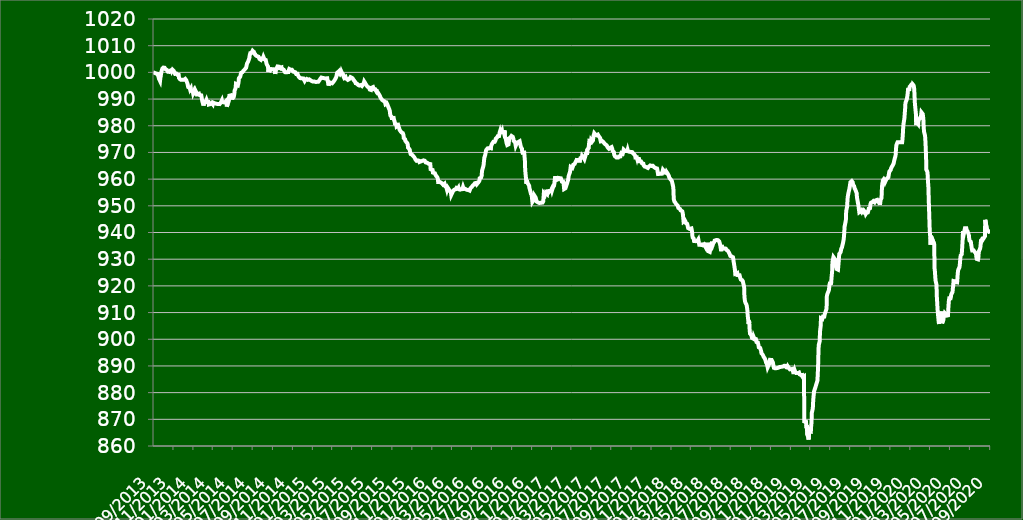
| Category | LAFISE20 |
|---|---|
| 2013-09-30 | 1000 |
| 2013-10-01 | 999.972 |
| 2013-10-02 | 999.948 |
| 2013-10-03 | 999.901 |
| 2013-10-04 | 999.84 |
| 2013-10-07 | 999.812 |
| 2013-10-08 | 999.609 |
| 2013-10-09 | 999.595 |
| 2013-10-10 | 999.647 |
| 2013-10-11 | 999.689 |
| 2013-10-14 | 999.425 |
| 2013-10-15 | 998.813 |
| 2013-10-16 | 998.53 |
| 2013-10-17 | 998.059 |
| 2013-10-18 | 997.559 |
| 2013-10-21 | 996.791 |
| 2013-10-22 | 997.87 |
| 2013-10-23 | 998.431 |
| 2013-10-24 | 998.327 |
| 2013-10-25 | 1000.137 |
| 2013-10-28 | 1001.399 |
| 2013-10-29 | 1001.602 |
| 2013-10-30 | 1001.772 |
| 2013-10-31 | 1001.79 |
| 2013-11-01 | 1001.677 |
| 2013-11-04 | 1001.725 |
| 2013-11-05 | 1001.739 |
| 2013-11-06 | 1001.503 |
| 2013-11-07 | 1001.173 |
| 2013-11-08 | 1001.018 |
| 2013-11-11 | 1000.909 |
| 2013-11-12 | 1001.022 |
| 2013-11-13 | 1000.542 |
| 2013-11-14 | 1000.24 |
| 2013-11-15 | 1000.123 |
| 2013-11-18 | 1000.179 |
| 2013-11-19 | 1000.231 |
| 2013-11-20 | 1000.245 |
| 2013-11-21 | 1000.627 |
| 2013-11-22 | 1000.759 |
| 2013-11-25 | 1000.895 |
| 2013-11-26 | 1000.518 |
| 2013-11-27 | 1000.768 |
| 2013-11-28 | 1000.989 |
| 2013-11-29 | 1000.909 |
| 2013-12-02 | 1000.499 |
| 2013-12-03 | 1000.424 |
| 2013-12-04 | 1000.382 |
| 2013-12-05 | 1000.212 |
| 2013-12-06 | 999.435 |
| 2013-12-09 | 999.585 |
| 2013-12-10 | 999.529 |
| 2013-12-11 | 999.637 |
| 2013-12-12 | 999.265 |
| 2013-12-13 | 999.095 |
| 2013-12-16 | 999.044 |
| 2013-12-17 | 999.034 |
| 2013-12-18 | 997.932 |
| 2013-12-19 | 997.644 |
| 2013-12-20 | 997.536 |
| 2013-12-23 | 997.211 |
| 2013-12-24 | 997.211 |
| 2014-01-02 | 997.201 |
| 2014-01-03 | 997.077 |
| 2014-01-06 | 997.564 |
| 2014-01-07 | 997.478 |
| 2014-01-08 | 997.511 |
| 2014-01-09 | 997.077 |
| 2014-01-10 | 996.829 |
| 2014-01-13 | 995.745 |
| 2014-01-14 | 995.735 |
| 2014-01-15 | 994.489 |
| 2014-01-16 | 994.37 |
| 2014-01-17 | 994.379 |
| 2014-01-20 | 994.083 |
| 2014-01-21 | 993.601 |
| 2014-01-22 | 993.892 |
| 2014-01-23 | 994.012 |
| 2014-01-24 | 993.128 |
| 2014-01-27 | 992.918 |
| 2014-01-28 | 993.171 |
| 2014-01-29 | 992.785 |
| 2014-01-30 | 992.197 |
| 2014-01-31 | 992.302 |
| 2014-02-03 | 993.381 |
| 2014-02-04 | 993.295 |
| 2014-02-05 | 992.837 |
| 2014-02-06 | 993.224 |
| 2014-02-07 | 993.3 |
| 2014-02-10 | 992.188 |
| 2014-02-11 | 992.469 |
| 2014-02-12 | 991.791 |
| 2014-02-13 | 991.911 |
| 2014-02-14 | 992.016 |
| 2014-02-17 | 992.011 |
| 2014-02-18 | 991.567 |
| 2014-02-19 | 991.739 |
| 2014-02-20 | 991.6 |
| 2014-02-21 | 991.491 |
| 2014-02-24 | 991.39 |
| 2014-02-25 | 991.152 |
| 2014-02-26 | 990.006 |
| 2014-02-27 | 989.256 |
| 2014-02-28 | 989.027 |
| 2014-03-03 | 987.58 |
| 2014-03-04 | 988.139 |
| 2014-03-05 | 988.95 |
| 2014-03-06 | 988.927 |
| 2014-03-07 | 989.237 |
| 2014-03-10 | 989.027 |
| 2014-03-11 | 989.122 |
| 2014-03-12 | 989.652 |
| 2014-03-13 | 989.509 |
| 2014-03-14 | 988.908 |
| 2014-03-17 | 988.97 |
| 2014-03-18 | 988.898 |
| 2014-03-19 | 987.957 |
| 2014-03-20 | 988.048 |
| 2014-03-21 | 987.986 |
| 2014-03-24 | 988.139 |
| 2014-03-25 | 988.091 |
| 2014-03-26 | 988.158 |
| 2014-03-27 | 988.416 |
| 2014-03-28 | 988.545 |
| 2014-03-31 | 988.081 |
| 2014-04-01 | 988.696 |
| 2014-04-02 | 988.648 |
| 2014-04-03 | 988.59 |
| 2014-04-04 | 988.546 |
| 2014-04-07 | 988.372 |
| 2014-04-08 | 988.275 |
| 2014-04-09 | 988.149 |
| 2014-04-10 | 988.202 |
| 2014-04-14 | 988.159 |
| 2014-04-15 | 988.178 |
| 2014-04-16 | 988.081 |
| 2014-04-21 | 988.111 |
| 2014-04-22 | 988.435 |
| 2014-04-23 | 988.425 |
| 2014-04-24 | 988.498 |
| 2014-04-25 | 988.599 |
| 2014-04-28 | 989.509 |
| 2014-04-29 | 988.948 |
| 2014-04-30 | 988.701 |
| 2014-05-02 | 988.672 |
| 2014-05-05 | 988.735 |
| 2014-05-06 | 988.846 |
| 2014-05-07 | 988.793 |
| 2014-05-08 | 988.793 |
| 2014-05-09 | 989.016 |
| 2014-05-12 | 989.417 |
| 2014-05-13 | 987.181 |
| 2014-05-14 | 987.06 |
| 2014-05-15 | 987.075 |
| 2014-05-16 | 988.265 |
| 2014-05-19 | 989.219 |
| 2014-05-20 | 990.066 |
| 2014-05-21 | 991.256 |
| 2014-05-22 | 991.252 |
| 2014-05-23 | 991.61 |
| 2014-05-26 | 991.421 |
| 2014-05-27 | 991.692 |
| 2014-05-28 | 991.74 |
| 2014-05-29 | 989.829 |
| 2014-05-30 | 990.235 |
| 2014-06-02 | 990.342 |
| 2014-06-03 | 990.743 |
| 2014-06-04 | 991.208 |
| 2014-06-05 | 991.803 |
| 2014-06-06 | 993.197 |
| 2014-06-09 | 994.151 |
| 2014-06-10 | 995.636 |
| 2014-06-11 | 995.453 |
| 2014-06-12 | 995.811 |
| 2014-06-13 | 995.67 |
| 2014-06-16 | 995.196 |
| 2014-06-17 | 995.312 |
| 2014-06-18 | 996.266 |
| 2014-06-19 | 997.814 |
| 2014-06-20 | 997.771 |
| 2014-06-23 | 998.366 |
| 2014-06-24 | 998.477 |
| 2014-06-25 | 999.412 |
| 2014-06-26 | 999.837 |
| 2014-06-27 | 1000.113 |
| 2014-06-30 | 1000.094 |
| 2014-07-01 | 1000.029 |
| 2014-07-02 | 1000.489 |
| 2014-07-03 | 1000.327 |
| 2014-07-04 | 1000.245 |
| 2014-07-07 | 1001.134 |
| 2014-07-08 | 1001.235 |
| 2014-07-09 | 1001.487 |
| 2014-07-10 | 1001.447 |
| 2014-07-11 | 1001.724 |
| 2014-07-14 | 1003.374 |
| 2014-07-15 | 1003.464 |
| 2014-07-16 | 1003.776 |
| 2014-07-17 | 1003.68 |
| 2014-07-18 | 1004.317 |
| 2014-07-21 | 1005.423 |
| 2014-07-22 | 1006.353 |
| 2014-07-23 | 1006.818 |
| 2014-07-24 | 1007.229 |
| 2014-07-28 | 1007.326 |
| 2014-07-29 | 1007.7 |
| 2014-07-30 | 1007.403 |
| 2014-07-31 | 1008.084 |
| 2014-08-01 | 1007.783 |
| 2014-08-04 | 1007.636 |
| 2014-08-05 | 1006.817 |
| 2014-08-06 | 1007.25 |
| 2014-08-07 | 1006.755 |
| 2014-08-08 | 1006.388 |
| 2014-08-11 | 1006.211 |
| 2014-08-12 | 1006.101 |
| 2014-08-13 | 1006.334 |
| 2014-08-14 | 1006.128 |
| 2014-08-18 | 1005.866 |
| 2014-08-19 | 1005.598 |
| 2014-08-20 | 1005.54 |
| 2014-08-21 | 1005.03 |
| 2014-08-22 | 1004.821 |
| 2014-08-25 | 1004.703 |
| 2014-08-26 | 1004.84 |
| 2014-08-27 | 1005.199 |
| 2014-08-28 | 1005.479 |
| 2014-08-29 | 1005.503 |
| 2014-09-01 | 1005.385 |
| 2014-09-02 | 1005.76 |
| 2014-09-03 | 1005.942 |
| 2014-09-04 | 1005.513 |
| 2014-09-05 | 1004.867 |
| 2014-09-08 | 1004.828 |
| 2014-09-09 | 1004.657 |
| 2014-09-10 | 1004.062 |
| 2014-09-11 | 1003.718 |
| 2014-09-12 | 1003.03 |
| 2014-09-16 | 1002.176 |
| 2014-09-17 | 1000.197 |
| 2014-09-18 | 1000.501 |
| 2014-09-19 | 1001.116 |
| 2014-09-22 | 1001.218 |
| 2014-09-23 | 1000.764 |
| 2014-09-24 | 1000.679 |
| 2014-09-25 | 1000.801 |
| 2014-09-26 | 1001.239 |
| 2014-09-29 | 1001.136 |
| 2014-09-30 | 1001.172 |
| 2014-10-01 | 1001.453 |
| 2014-10-02 | 1001.171 |
| 2014-10-03 | 1001.041 |
| 2014-10-06 | 1001.095 |
| 2014-10-07 | 1001.102 |
| 2014-10-08 | 999.43 |
| 2014-10-09 | 999.479 |
| 2014-10-10 | 1001.178 |
| 2014-10-13 | 1001.701 |
| 2014-10-14 | 1001.808 |
| 2014-10-15 | 1002.22 |
| 2014-10-16 | 1002.151 |
| 2014-10-17 | 1002.212 |
| 2014-10-20 | 1002.117 |
| 2014-10-21 | 1001.682 |
| 2014-10-22 | 1001.668 |
| 2014-10-23 | 1001.611 |
| 2014-10-24 | 1001.624 |
| 2014-10-27 | 1001.885 |
| 2014-10-28 | 1000.68 |
| 2014-10-29 | 1000.554 |
| 2014-10-30 | 1001.28 |
| 2014-10-31 | 1001.179 |
| 2014-11-03 | 1000.981 |
| 2014-11-04 | 1000.648 |
| 2014-11-05 | 1000.732 |
| 2014-11-06 | 1000.631 |
| 2014-11-07 | 1000.081 |
| 2014-11-10 | 999.946 |
| 2014-11-11 | 1000.049 |
| 2014-11-12 | 1000.145 |
| 2014-11-13 | 1000.08 |
| 2014-11-14 | 1000.08 |
| 2014-11-17 | 1000.116 |
| 2014-11-18 | 1000.641 |
| 2014-11-19 | 1000.966 |
| 2014-11-20 | 1001.274 |
| 2014-11-21 | 1001.141 |
| 2014-11-24 | 1001.014 |
| 2014-11-25 | 1000.974 |
| 2014-11-26 | 1001.034 |
| 2014-11-27 | 1001.101 |
| 2014-11-28 | 1000.999 |
| 2014-12-01 | 1000.906 |
| 2014-12-02 | 1000.285 |
| 2014-12-03 | 1000.277 |
| 2014-12-04 | 1000.165 |
| 2014-12-05 | 1000.14 |
| 2014-12-08 | 1000.082 |
| 2014-12-09 | 999.974 |
| 2014-12-10 | 999.917 |
| 2014-12-11 | 999.422 |
| 2014-12-12 | 999.689 |
| 2014-12-15 | 999.459 |
| 2014-12-16 | 999.207 |
| 2014-12-17 | 998.825 |
| 2014-12-18 | 998.592 |
| 2014-12-19 | 998.363 |
| 2014-12-22 | 998.314 |
| 2014-12-23 | 997.848 |
| 2014-12-24 | 997.848 |
| 2015-01-02 | 997.717 |
| 2015-01-05 | 997.673 |
| 2015-01-06 | 996.798 |
| 2015-01-07 | 996.674 |
| 2015-01-08 | 997.198 |
| 2015-01-09 | 997.405 |
| 2015-01-12 | 997.548 |
| 2015-01-13 | 997.505 |
| 2015-01-14 | 997.467 |
| 2015-01-15 | 997.467 |
| 2015-01-16 | 997.204 |
| 2015-01-19 | 997.018 |
| 2015-01-20 | 997.384 |
| 2015-01-21 | 997.359 |
| 2015-01-22 | 997.734 |
| 2015-01-23 | 997.351 |
| 2015-01-26 | 996.846 |
| 2015-01-27 | 996.635 |
| 2015-01-28 | 996.692 |
| 2015-01-29 | 996.65 |
| 2015-01-30 | 996.625 |
| 2015-02-02 | 996.727 |
| 2015-02-03 | 996.624 |
| 2015-02-04 | 996.851 |
| 2015-02-05 | 996.779 |
| 2015-02-06 | 996.407 |
| 2015-02-09 | 996.421 |
| 2015-02-10 | 996.625 |
| 2015-02-11 | 996.433 |
| 2015-02-13 | 996.446 |
| 2015-02-16 | 996.426 |
| 2015-02-17 | 996.503 |
| 2015-02-18 | 996.477 |
| 2015-02-19 | 996.827 |
| 2015-02-20 | 997.046 |
| 2015-02-23 | 997.614 |
| 2015-02-24 | 997.531 |
| 2015-02-25 | 997.794 |
| 2015-02-26 | 998.063 |
| 2015-02-27 | 998.111 |
| 2015-03-02 | 997.926 |
| 2015-03-03 | 997.953 |
| 2015-03-04 | 998.053 |
| 2015-03-05 | 997.911 |
| 2015-03-06 | 997.842 |
| 2015-03-09 | 997.813 |
| 2015-03-10 | 997.71 |
| 2015-03-11 | 997.785 |
| 2015-03-12 | 997.745 |
| 2015-03-13 | 997.65 |
| 2015-03-16 | 997.785 |
| 2015-03-17 | 997.086 |
| 2015-03-18 | 996.434 |
| 2015-03-19 | 995.871 |
| 2015-03-20 | 995.052 |
| 2015-03-23 | 996.279 |
| 2015-03-24 | 996.363 |
| 2015-03-25 | 996.432 |
| 2015-03-26 | 996.21 |
| 2015-03-27 | 996.047 |
| 2015-03-30 | 995.901 |
| 2015-03-31 | 995.894 |
| 2015-04-01 | 995.988 |
| 2015-04-06 | 996.793 |
| 2015-04-07 | 996.629 |
| 2015-04-08 | 996.831 |
| 2015-04-09 | 996.99 |
| 2015-04-10 | 997.618 |
| 2015-04-13 | 998.42 |
| 2015-04-14 | 998.632 |
| 2015-04-15 | 999.779 |
| 2015-04-16 | 999.496 |
| 2015-04-17 | 1000.042 |
| 2015-04-20 | 1000.354 |
| 2015-04-21 | 999.739 |
| 2015-04-22 | 999.755 |
| 2015-04-23 | 999.588 |
| 2015-04-24 | 999.309 |
| 2015-04-27 | 999.872 |
| 2015-04-28 | 1000.319 |
| 2015-04-29 | 1000.057 |
| 2015-04-30 | 999.774 |
| 2015-05-04 | 999.147 |
| 2015-05-05 | 998.374 |
| 2015-05-06 | 998.084 |
| 2015-05-07 | 997.888 |
| 2015-05-08 | 997.929 |
| 2015-05-11 | 998.247 |
| 2015-05-12 | 997.804 |
| 2015-05-13 | 997.719 |
| 2015-05-14 | 997.454 |
| 2015-05-15 | 997.788 |
| 2015-05-18 | 997.185 |
| 2015-05-19 | 997.53 |
| 2015-05-20 | 997.08 |
| 2015-05-21 | 996.98 |
| 2015-05-22 | 997.456 |
| 2015-05-25 | 997.693 |
| 2015-05-26 | 998.229 |
| 2015-05-27 | 998.132 |
| 2015-05-28 | 998.059 |
| 2015-05-29 | 998.277 |
| 2015-06-01 | 997.839 |
| 2015-06-02 | 998.033 |
| 2015-06-03 | 997.847 |
| 2015-06-04 | 997.635 |
| 2015-06-05 | 997.09 |
| 2015-06-08 | 996.791 |
| 2015-06-09 | 996.471 |
| 2015-06-10 | 996.328 |
| 2015-06-11 | 995.921 |
| 2015-06-12 | 995.785 |
| 2015-06-15 | 995.766 |
| 2015-06-16 | 995.484 |
| 2015-06-17 | 995.582 |
| 2015-06-18 | 995.321 |
| 2015-06-19 | 995.216 |
| 2015-06-22 | 995.084 |
| 2015-06-23 | 995.238 |
| 2015-06-24 | 995.138 |
| 2015-06-25 | 995.149 |
| 2015-06-26 | 995.239 |
| 2015-06-29 | 995.095 |
| 2015-06-30 | 994.895 |
| 2015-07-01 | 994.845 |
| 2015-07-02 | 994.876 |
| 2015-07-03 | 994.847 |
| 2015-07-06 | 996.088 |
| 2015-07-07 | 996.563 |
| 2015-07-08 | 996.367 |
| 2015-07-09 | 996.248 |
| 2015-07-10 | 995.985 |
| 2015-07-13 | 995.312 |
| 2015-07-14 | 995.148 |
| 2015-07-15 | 995.473 |
| 2015-07-16 | 995.042 |
| 2015-07-17 | 994.643 |
| 2015-07-20 | 994.384 |
| 2015-07-21 | 994.391 |
| 2015-07-22 | 994.45 |
| 2015-07-23 | 994.49 |
| 2015-07-24 | 993.58 |
| 2015-07-27 | 993.479 |
| 2015-07-28 | 993.413 |
| 2015-07-29 | 993.512 |
| 2015-07-30 | 994.222 |
| 2015-07-31 | 994.147 |
| 2015-08-03 | 994.464 |
| 2015-08-04 | 994.381 |
| 2015-08-05 | 993.718 |
| 2015-08-06 | 993.796 |
| 2015-08-07 | 993.705 |
| 2015-08-10 | 993.66 |
| 2015-08-11 | 993.363 |
| 2015-08-12 | 993.199 |
| 2015-08-13 | 993.599 |
| 2015-08-14 | 992.903 |
| 2015-08-17 | 992.556 |
| 2015-08-18 | 992.374 |
| 2015-08-19 | 992.09 |
| 2015-08-20 | 992.24 |
| 2015-08-21 | 991.807 |
| 2015-08-24 | 991.127 |
| 2015-08-25 | 990.869 |
| 2015-08-26 | 990.48 |
| 2015-08-27 | 990.358 |
| 2015-08-28 | 990.211 |
| 2015-08-31 | 989.666 |
| 2015-09-01 | 989.693 |
| 2015-09-02 | 989.589 |
| 2015-09-03 | 989.393 |
| 2015-09-04 | 989.304 |
| 2015-09-07 | 989.263 |
| 2015-09-08 | 989.084 |
| 2015-09-09 | 988.577 |
| 2015-09-10 | 988.08 |
| 2015-09-11 | 988.389 |
| 2015-09-14 | 988.407 |
| 2015-09-16 | 987.869 |
| 2015-09-17 | 987.845 |
| 2015-09-18 | 987.844 |
| 2015-09-21 | 986.357 |
| 2015-09-22 | 986.147 |
| 2015-09-23 | 985.706 |
| 2015-09-24 | 984.666 |
| 2015-09-25 | 983.846 |
| 2015-09-28 | 983.422 |
| 2015-09-29 | 982.898 |
| 2015-09-30 | 982.814 |
| 2015-10-01 | 982.959 |
| 2015-10-02 | 982.859 |
| 2015-10-05 | 982.932 |
| 2015-10-06 | 982.287 |
| 2015-10-07 | 982.013 |
| 2015-10-08 | 981.524 |
| 2015-10-09 | 980.757 |
| 2015-10-13 | 980.556 |
| 2015-10-14 | 979.741 |
| 2015-10-15 | 979.985 |
| 2015-10-16 | 980.06 |
| 2015-10-19 | 980.18 |
| 2015-10-20 | 979.98 |
| 2015-10-21 | 979.847 |
| 2015-10-22 | 979.023 |
| 2015-10-23 | 978.54 |
| 2015-10-26 | 977.966 |
| 2015-10-28 | 977.71 |
| 2015-10-29 | 977.496 |
| 2015-10-30 | 977.279 |
| 2015-11-02 | 977.223 |
| 2015-11-03 | 977.132 |
| 2015-11-04 | 976.519 |
| 2015-11-05 | 975.354 |
| 2015-11-06 | 974.991 |
| 2015-11-09 | 974.893 |
| 2015-11-10 | 974.261 |
| 2015-11-11 | 974.391 |
| 2015-11-12 | 974.072 |
| 2015-11-13 | 973.866 |
| 2015-11-16 | 973.394 |
| 2015-11-17 | 972.951 |
| 2015-11-18 | 971.803 |
| 2015-11-19 | 971.96 |
| 2015-11-20 | 971.598 |
| 2015-11-23 | 971.075 |
| 2015-11-24 | 970.296 |
| 2015-11-25 | 970.233 |
| 2015-11-26 | 969.386 |
| 2015-11-27 | 969.044 |
| 2015-11-30 | 969.177 |
| 2015-12-01 | 969.457 |
| 2015-12-02 | 969.357 |
| 2015-12-03 | 968.756 |
| 2015-12-04 | 968.455 |
| 2015-12-07 | 968.224 |
| 2015-12-08 | 968.359 |
| 2015-12-09 | 968.313 |
| 2015-12-10 | 967.978 |
| 2015-12-11 | 967.271 |
| 2015-12-14 | 966.87 |
| 2015-12-15 | 967.003 |
| 2015-12-16 | 966.695 |
| 2015-12-17 | 966.908 |
| 2015-12-18 | 967.016 |
| 2015-12-21 | 966.905 |
| 2015-12-22 | 966.867 |
| 2015-12-23 | 966.433 |
| 2015-12-24 | 966.577 |
| 2016-01-04 | 967.021 |
| 2016-01-05 | 967.162 |
| 2016-01-06 | 966.938 |
| 2016-01-07 | 966.888 |
| 2016-01-08 | 966.878 |
| 2016-01-11 | 966.256 |
| 2016-01-12 | 966.374 |
| 2016-01-13 | 966.015 |
| 2016-01-14 | 966.07 |
| 2016-01-15 | 966.171 |
| 2016-01-18 | 966.095 |
| 2016-01-19 | 965.79 |
| 2016-01-20 | 965.767 |
| 2016-01-21 | 965.638 |
| 2016-01-22 | 965.649 |
| 2016-01-25 | 965.631 |
| 2016-01-26 | 963.718 |
| 2016-01-27 | 963.844 |
| 2016-01-28 | 963.623 |
| 2016-01-29 | 963.385 |
| 2016-02-01 | 963.431 |
| 2016-02-02 | 962.455 |
| 2016-02-03 | 962.631 |
| 2016-02-04 | 962.632 |
| 2016-02-05 | 962.478 |
| 2016-02-08 | 962.191 |
| 2016-02-09 | 962.223 |
| 2016-02-10 | 962.499 |
| 2016-02-11 | 961.342 |
| 2016-02-12 | 961.264 |
| 2016-02-15 | 960.756 |
| 2016-02-16 | 960.487 |
| 2016-02-17 | 960.167 |
| 2016-02-18 | 958.94 |
| 2016-02-19 | 959.061 |
| 2016-02-22 | 958.975 |
| 2016-02-23 | 958.83 |
| 2016-02-24 | 958.995 |
| 2016-02-25 | 958.78 |
| 2016-02-26 | 958.736 |
| 2016-02-29 | 958.785 |
| 2016-03-01 | 958.38 |
| 2016-03-02 | 958.191 |
| 2016-03-03 | 958.03 |
| 2016-03-04 | 957.935 |
| 2016-03-07 | 958.279 |
| 2016-03-08 | 958.291 |
| 2016-03-09 | 957.554 |
| 2016-03-10 | 957.645 |
| 2016-03-11 | 957.381 |
| 2016-03-14 | 956.94 |
| 2016-03-15 | 956.863 |
| 2016-03-16 | 956.025 |
| 2016-03-17 | 955.975 |
| 2016-03-18 | 956.833 |
| 2016-03-21 | 956.276 |
| 2016-03-22 | 955.99 |
| 2016-03-23 | 955.875 |
| 2016-03-28 | 954.967 |
| 2016-03-29 | 954.102 |
| 2016-03-30 | 953.94 |
| 2016-03-31 | 954.099 |
| 2016-04-01 | 954.459 |
| 2016-04-04 | 955.67 |
| 2016-04-05 | 955.746 |
| 2016-04-06 | 955.611 |
| 2016-04-07 | 956.017 |
| 2016-04-08 | 956.097 |
| 2016-04-12 | 956.249 |
| 2016-04-13 | 956.522 |
| 2016-04-14 | 956.688 |
| 2016-04-15 | 956.85 |
| 2016-04-18 | 956.404 |
| 2016-04-19 | 956.512 |
| 2016-04-20 | 956.794 |
| 2016-04-21 | 956.244 |
| 2016-04-22 | 956.467 |
| 2016-04-25 | 956.053 |
| 2016-04-26 | 956.174 |
| 2016-04-27 | 955.935 |
| 2016-04-28 | 956.192 |
| 2016-04-29 | 956.237 |
| 2016-05-02 | 956.575 |
| 2016-05-03 | 956.604 |
| 2016-05-04 | 957.031 |
| 2016-05-05 | 956.775 |
| 2016-05-06 | 956.313 |
| 2016-05-09 | 956.023 |
| 2016-05-10 | 956.39 |
| 2016-05-11 | 956.396 |
| 2016-05-12 | 956.321 |
| 2016-05-13 | 956.332 |
| 2016-05-16 | 955.972 |
| 2016-05-17 | 955.838 |
| 2016-05-18 | 955.719 |
| 2016-05-19 | 955.951 |
| 2016-05-20 | 955.97 |
| 2016-05-23 | 955.988 |
| 2016-05-24 | 955.724 |
| 2016-05-25 | 955.991 |
| 2016-05-26 | 955.871 |
| 2016-05-27 | 956.652 |
| 2016-05-30 | 956.848 |
| 2016-05-31 | 957.108 |
| 2016-06-01 | 957.367 |
| 2016-06-02 | 957.46 |
| 2016-06-03 | 957.629 |
| 2016-06-06 | 957.841 |
| 2016-06-07 | 957.998 |
| 2016-06-08 | 958.121 |
| 2016-06-09 | 958.459 |
| 2016-06-10 | 958.604 |
| 2016-06-13 | 958.576 |
| 2016-06-14 | 958.294 |
| 2016-06-15 | 958.072 |
| 2016-06-16 | 958.133 |
| 2016-06-17 | 958.35 |
| 2016-06-20 | 958.821 |
| 2016-06-21 | 958.896 |
| 2016-06-22 | 958.988 |
| 2016-06-23 | 959.388 |
| 2016-06-24 | 960.328 |
| 2016-06-27 | 960.126 |
| 2016-06-28 | 960.607 |
| 2016-06-29 | 960.854 |
| 2016-06-30 | 961.288 |
| 2016-07-01 | 963.095 |
| 2016-07-04 | 963.184 |
| 2016-07-05 | 964.809 |
| 2016-07-06 | 965.438 |
| 2016-07-07 | 966.755 |
| 2016-07-08 | 967.943 |
| 2016-07-11 | 969.159 |
| 2016-07-12 | 969.173 |
| 2016-07-13 | 970.525 |
| 2016-07-14 | 970.905 |
| 2016-07-15 | 971.219 |
| 2016-07-18 | 971.538 |
| 2016-07-19 | 971.391 |
| 2016-07-20 | 971.384 |
| 2016-07-21 | 971.229 |
| 2016-07-22 | 971.613 |
| 2016-07-26 | 971.411 |
| 2016-07-27 | 970.904 |
| 2016-07-28 | 971.343 |
| 2016-07-29 | 972.44 |
| 2016-08-01 | 973.294 |
| 2016-08-03 | 973.566 |
| 2016-08-04 | 973.525 |
| 2016-08-05 | 974.018 |
| 2016-08-08 | 973.766 |
| 2016-08-09 | 974.003 |
| 2016-08-10 | 974.242 |
| 2016-08-11 | 974.473 |
| 2016-08-12 | 975.105 |
| 2016-08-16 | 975.613 |
| 2016-08-17 | 975.882 |
| 2016-08-18 | 976.067 |
| 2016-08-19 | 976.108 |
| 2016-08-22 | 976.126 |
| 2016-08-23 | 976.8 |
| 2016-08-24 | 977.467 |
| 2016-08-25 | 977.87 |
| 2016-08-26 | 977.357 |
| 2016-08-29 | 977.76 |
| 2016-08-30 | 978.058 |
| 2016-08-31 | 978.244 |
| 2016-09-01 | 977.499 |
| 2016-09-02 | 977.364 |
| 2016-09-05 | 977.42 |
| 2016-09-06 | 977.466 |
| 2016-09-07 | 977.466 |
| 2016-09-08 | 978.288 |
| 2016-09-09 | 975.763 |
| 2016-09-12 | 975.005 |
| 2016-09-13 | 974.277 |
| 2016-09-14 | 973.534 |
| 2016-09-16 | 972.782 |
| 2016-09-19 | 972.596 |
| 2016-09-20 | 973.025 |
| 2016-09-21 | 973.888 |
| 2016-09-22 | 975.314 |
| 2016-09-23 | 975.632 |
| 2016-09-26 | 975.604 |
| 2016-09-27 | 975.318 |
| 2016-09-28 | 975.667 |
| 2016-09-29 | 976.178 |
| 2016-09-30 | 976.07 |
| 2016-10-03 | 975.85 |
| 2016-10-04 | 975.95 |
| 2016-10-05 | 975.07 |
| 2016-10-06 | 974.31 |
| 2016-10-07 | 974.04 |
| 2016-10-10 | 973.9 |
| 2016-10-11 | 973.21 |
| 2016-10-12 | 972.53 |
| 2016-10-13 | 972.51 |
| 2016-10-14 | 973.11 |
| 2016-10-18 | 973.49 |
| 2016-10-19 | 973.49 |
| 2016-10-20 | 973.9 |
| 2016-10-21 | 973.917 |
| 2016-10-24 | 974.194 |
| 2016-10-25 | 973.857 |
| 2016-10-26 | 973.066 |
| 2016-10-27 | 972.477 |
| 2016-10-28 | 971.999 |
| 2016-10-31 | 971.396 |
| 2016-11-01 | 970.269 |
| 2016-11-02 | 969.884 |
| 2016-11-03 | 970.118 |
| 2016-11-04 | 970.195 |
| 2016-11-07 | 969.955 |
| 2016-11-08 | 970.019 |
| 2016-11-09 | 967.024 |
| 2016-11-10 | 963.365 |
| 2016-11-11 | 963.194 |
| 2016-11-14 | 958.271 |
| 2016-11-15 | 959.617 |
| 2016-11-16 | 959.172 |
| 2016-11-17 | 958.862 |
| 2016-11-18 | 958.408 |
| 2016-11-21 | 958.217 |
| 2016-11-22 | 957.533 |
| 2016-11-23 | 956.628 |
| 2016-11-24 | 956.59 |
| 2016-11-25 | 955.821 |
| 2016-11-28 | 954.24 |
| 2016-11-29 | 954.773 |
| 2016-11-30 | 953.855 |
| 2016-12-01 | 952.657 |
| 2016-12-02 | 951.483 |
| 2016-12-05 | 952.063 |
| 2016-12-06 | 952.121 |
| 2016-12-07 | 952.773 |
| 2016-12-08 | 953.834 |
| 2016-12-09 | 953.825 |
| 2016-12-12 | 953.084 |
| 2016-12-13 | 952.553 |
| 2016-12-14 | 952.265 |
| 2016-12-15 | 951.608 |
| 2016-12-16 | 951.294 |
| 2016-12-19 | 951.288 |
| 2016-12-20 | 951.572 |
| 2016-12-21 | 951.484 |
| 2016-12-22 | 951.437 |
| 2016-12-23 | 951.066 |
| 2017-01-02 | 951.21 |
| 2017-01-03 | 951.088 |
| 2017-01-04 | 951.678 |
| 2017-01-05 | 953.074 |
| 2017-01-06 | 954.722 |
| 2017-01-09 | 954.265 |
| 2017-01-10 | 954.903 |
| 2017-01-11 | 954.305 |
| 2017-01-12 | 954.841 |
| 2017-01-13 | 954.5 |
| 2017-01-16 | 954.381 |
| 2017-01-17 | 955.323 |
| 2017-01-18 | 956.074 |
| 2017-01-19 | 956.311 |
| 2017-01-20 | 955.001 |
| 2017-01-23 | 955.562 |
| 2017-01-24 | 955.611 |
| 2017-01-25 | 955.329 |
| 2017-01-26 | 955.444 |
| 2017-01-27 | 955.551 |
| 2017-01-30 | 956.317 |
| 2017-01-31 | 955.827 |
| 2017-02-01 | 956.095 |
| 2017-02-02 | 956.65 |
| 2017-02-03 | 956.804 |
| 2017-02-06 | 957.536 |
| 2017-02-07 | 958.052 |
| 2017-02-08 | 959.301 |
| 2017-02-09 | 960.426 |
| 2017-02-10 | 960.472 |
| 2017-02-13 | 960.451 |
| 2017-02-14 | 960.301 |
| 2017-02-15 | 959.729 |
| 2017-02-16 | 960.017 |
| 2017-02-17 | 960.008 |
| 2017-02-20 | 960.037 |
| 2017-02-21 | 960.421 |
| 2017-02-22 | 960.092 |
| 2017-02-23 | 960.346 |
| 2017-02-24 | 960.331 |
| 2017-02-27 | 960.307 |
| 2017-02-28 | 960.063 |
| 2017-03-01 | 960.024 |
| 2017-03-02 | 959.115 |
| 2017-03-03 | 959.133 |
| 2017-03-06 | 959.043 |
| 2017-03-07 | 958.613 |
| 2017-03-08 | 957.687 |
| 2017-03-09 | 956.294 |
| 2017-03-10 | 956.234 |
| 2017-03-13 | 956.581 |
| 2017-03-14 | 956.228 |
| 2017-03-15 | 956.232 |
| 2017-03-16 | 957.67 |
| 2017-03-17 | 958.036 |
| 2017-03-20 | 959.237 |
| 2017-03-21 | 959.692 |
| 2017-03-22 | 960.372 |
| 2017-03-23 | 961.284 |
| 2017-03-24 | 961.528 |
| 2017-03-27 | 962.687 |
| 2017-03-28 | 963.017 |
| 2017-03-29 | 964.564 |
| 2017-03-30 | 964.706 |
| 2017-03-31 | 964.284 |
| 2017-04-03 | 964.181 |
| 2017-04-04 | 963.905 |
| 2017-04-05 | 964.884 |
| 2017-04-06 | 965.405 |
| 2017-04-07 | 965.591 |
| 2017-04-10 | 965.683 |
| 2017-04-12 | 966.204 |
| 2017-04-17 | 967.357 |
| 2017-04-18 | 967.825 |
| 2017-04-19 | 967.16 |
| 2017-04-20 | 966.983 |
| 2017-04-21 | 966.926 |
| 2017-04-24 | 966.689 |
| 2017-04-25 | 966.273 |
| 2017-04-26 | 966.886 |
| 2017-04-27 | 967.227 |
| 2017-04-28 | 967.891 |
| 2017-05-02 | 968.054 |
| 2017-05-03 | 968.718 |
| 2017-05-04 | 968.38 |
| 2017-05-05 | 968.503 |
| 2017-05-08 | 967.918 |
| 2017-05-09 | 967.757 |
| 2017-05-10 | 967.482 |
| 2017-05-11 | 967.741 |
| 2017-05-12 | 968.294 |
| 2017-05-15 | 969.617 |
| 2017-05-16 | 969.935 |
| 2017-05-17 | 970.219 |
| 2017-05-18 | 969.101 |
| 2017-05-19 | 971.115 |
| 2017-05-22 | 971.158 |
| 2017-05-23 | 971.673 |
| 2017-05-24 | 973.091 |
| 2017-05-25 | 974.132 |
| 2017-05-26 | 974.066 |
| 2017-05-29 | 973.86 |
| 2017-05-30 | 974.579 |
| 2017-05-31 | 974.257 |
| 2017-06-01 | 974.295 |
| 2017-06-02 | 973.999 |
| 2017-06-05 | 974.469 |
| 2017-06-06 | 975.474 |
| 2017-06-07 | 976.308 |
| 2017-06-08 | 976.704 |
| 2017-06-09 | 977.2 |
| 2017-06-12 | 976.761 |
| 2017-06-13 | 976.563 |
| 2017-06-14 | 976.563 |
| 2017-06-15 | 976.777 |
| 2017-06-16 | 976.451 |
| 2017-06-19 | 976.814 |
| 2017-06-20 | 976.705 |
| 2017-06-21 | 976.975 |
| 2017-06-22 | 976.452 |
| 2017-06-23 | 976.069 |
| 2017-06-26 | 975.718 |
| 2017-06-27 | 975.417 |
| 2017-06-28 | 974.68 |
| 2017-06-29 | 974.156 |
| 2017-06-30 | 974.219 |
| 2017-07-03 | 974.295 |
| 2017-07-04 | 974.216 |
| 2017-07-05 | 974.164 |
| 2017-07-06 | 974.096 |
| 2017-07-07 | 973.879 |
| 2017-07-10 | 973.615 |
| 2017-07-11 | 973.221 |
| 2017-07-12 | 973.103 |
| 2017-07-13 | 973.096 |
| 2017-07-14 | 972.937 |
| 2017-07-17 | 972.666 |
| 2017-07-18 | 972.496 |
| 2017-07-19 | 972.374 |
| 2017-07-20 | 971.913 |
| 2017-07-21 | 971.564 |
| 2017-07-24 | 971.393 |
| 2017-07-26 | 971.517 |
| 2017-07-27 | 971.538 |
| 2017-07-28 | 971.76 |
| 2017-07-31 | 971.512 |
| 2017-08-01 | 972 |
| 2017-08-03 | 971.342 |
| 2017-08-04 | 970.659 |
| 2017-08-07 | 970.493 |
| 2017-08-08 | 970.106 |
| 2017-08-09 | 969.177 |
| 2017-08-10 | 968.966 |
| 2017-08-11 | 968.615 |
| 2017-08-14 | 968.306 |
| 2017-08-16 | 968.101 |
| 2017-08-17 | 968.004 |
| 2017-08-18 | 968.046 |
| 2017-08-21 | 968.087 |
| 2017-08-22 | 968.125 |
| 2017-08-23 | 968.469 |
| 2017-08-24 | 968.52 |
| 2017-08-25 | 968.431 |
| 2017-08-28 | 968.515 |
| 2017-08-29 | 968.575 |
| 2017-08-30 | 968.832 |
| 2017-08-31 | 969.745 |
| 2017-09-01 | 969.46 |
| 2017-09-04 | 969.502 |
| 2017-09-05 | 969.919 |
| 2017-09-06 | 970.18 |
| 2017-09-07 | 971.055 |
| 2017-09-08 | 970.742 |
| 2017-09-11 | 970.58 |
| 2017-09-12 | 970.405 |
| 2017-09-13 | 970.537 |
| 2017-09-14 | 970.598 |
| 2017-09-18 | 970.492 |
| 2017-09-19 | 970.939 |
| 2017-09-20 | 970.476 |
| 2017-09-21 | 970.307 |
| 2017-09-22 | 970.248 |
| 2017-09-25 | 970.234 |
| 2017-09-26 | 970.265 |
| 2017-09-27 | 970.129 |
| 2017-09-28 | 970.222 |
| 2017-09-29 | 970.192 |
| 2017-10-02 | 970.248 |
| 2017-10-03 | 970.127 |
| 2017-10-04 | 970.106 |
| 2017-10-05 | 969.9 |
| 2017-10-06 | 969.602 |
| 2017-10-09 | 969.358 |
| 2017-10-10 | 969.186 |
| 2017-10-11 | 969.268 |
| 2017-10-12 | 968.766 |
| 2017-10-13 | 968.122 |
| 2017-10-17 | 968.181 |
| 2017-10-18 | 967.737 |
| 2017-10-19 | 968.151 |
| 2017-10-20 | 967.596 |
| 2017-10-23 | 967.78 |
| 2017-10-24 | 967.555 |
| 2017-10-25 | 967.124 |
| 2017-10-26 | 966.657 |
| 2017-10-27 | 966.629 |
| 2017-10-30 | 966.643 |
| 2017-10-31 | 966.521 |
| 2017-11-01 | 966.297 |
| 2017-11-02 | 965.947 |
| 2017-11-03 | 965.985 |
| 2017-11-06 | 965.779 |
| 2017-11-07 | 965.18 |
| 2017-11-08 | 964.951 |
| 2017-11-09 | 964.883 |
| 2017-11-10 | 964.718 |
| 2017-11-13 | 964.596 |
| 2017-11-14 | 964.578 |
| 2017-11-15 | 964.474 |
| 2017-11-16 | 964.501 |
| 2017-11-17 | 964.424 |
| 2017-11-20 | 964.196 |
| 2017-11-21 | 964.205 |
| 2017-11-22 | 964.568 |
| 2017-11-23 | 964.706 |
| 2017-11-24 | 965.041 |
| 2017-11-27 | 965.114 |
| 2017-11-28 | 965.072 |
| 2017-11-29 | 965.236 |
| 2017-11-30 | 965.17 |
| 2017-12-01 | 964.94 |
| 2017-12-04 | 965.15 |
| 2017-12-05 | 965.004 |
| 2017-12-06 | 965.127 |
| 2017-12-07 | 964.712 |
| 2017-12-08 | 964.578 |
| 2017-12-11 | 964.301 |
| 2017-12-12 | 964.203 |
| 2017-12-13 | 964.07 |
| 2017-12-14 | 964.134 |
| 2017-12-15 | 963.947 |
| 2017-12-18 | 963.99 |
| 2017-12-19 | 963.407 |
| 2017-12-20 | 963.296 |
| 2017-12-21 | 961.924 |
| 2017-12-22 | 961.915 |
| 2018-01-02 | 962.044 |
| 2018-01-03 | 962.49 |
| 2018-01-04 | 962.532 |
| 2018-01-05 | 963.51 |
| 2018-01-08 | 963.468 |
| 2018-01-09 | 962.895 |
| 2018-01-10 | 962.47 |
| 2018-01-11 | 962.497 |
| 2018-01-12 | 962.326 |
| 2018-01-15 | 962.324 |
| 2018-01-16 | 962.71 |
| 2018-01-17 | 962.831 |
| 2018-01-18 | 962.829 |
| 2018-01-19 | 962.151 |
| 2018-01-22 | 961.815 |
| 2018-01-23 | 961.181 |
| 2018-01-24 | 960.692 |
| 2018-01-25 | 960.993 |
| 2018-01-26 | 960.26 |
| 2018-01-29 | 959.822 |
| 2018-01-30 | 960.008 |
| 2018-01-31 | 959.554 |
| 2018-02-01 | 959.36 |
| 2018-02-02 | 958.898 |
| 2018-02-05 | 957.285 |
| 2018-02-06 | 956.044 |
| 2018-02-07 | 952.568 |
| 2018-02-08 | 952.314 |
| 2018-02-09 | 951.62 |
| 2018-02-12 | 951.134 |
| 2018-02-13 | 950.888 |
| 2018-02-14 | 950.699 |
| 2018-02-15 | 950.86 |
| 2018-02-16 | 950.39 |
| 2018-02-19 | 950.106 |
| 2018-02-20 | 949.649 |
| 2018-02-21 | 949.214 |
| 2018-02-22 | 949.172 |
| 2018-02-23 | 949.193 |
| 2018-02-26 | 948.82 |
| 2018-02-27 | 948.956 |
| 2018-02-28 | 948.31 |
| 2018-03-01 | 948.489 |
| 2018-03-02 | 947.943 |
| 2018-03-05 | 947.927 |
| 2018-03-06 | 947.534 |
| 2018-03-07 | 946.77 |
| 2018-03-08 | 946.635 |
| 2018-03-09 | 944.122 |
| 2018-03-12 | 944.471 |
| 2018-03-13 | 944.543 |
| 2018-03-14 | 944.563 |
| 2018-03-15 | 944.066 |
| 2018-03-16 | 943.559 |
| 2018-03-19 | 943.23 |
| 2018-03-20 | 943.23 |
| 2018-03-21 | 942.719 |
| 2018-03-22 | 942.532 |
| 2018-03-23 | 941.645 |
| 2018-03-26 | 941.37 |
| 2018-03-27 | 941.369 |
| 2018-03-28 | 941.596 |
| 2018-04-02 | 941.546 |
| 2018-04-03 | 941.529 |
| 2018-04-04 | 940.264 |
| 2018-04-05 | 938.683 |
| 2018-04-06 | 938.129 |
| 2018-04-09 | 937.709 |
| 2018-04-10 | 936.825 |
| 2018-04-12 | 936.719 |
| 2018-04-13 | 936.46 |
| 2018-04-16 | 936.745 |
| 2018-04-17 | 936.736 |
| 2018-04-18 | 936.714 |
| 2018-04-19 | 937.005 |
| 2018-04-20 | 936.86 |
| 2018-04-23 | 937.427 |
| 2018-04-24 | 936.814 |
| 2018-04-25 | 936.056 |
| 2018-04-26 | 935.369 |
| 2018-04-27 | 935.417 |
| 2018-05-30 | 935.415 |
| 2018-05-02 | 935.403 |
| 2018-05-03 | 935.495 |
| 2018-05-04 | 935.428 |
| 2018-05-07 | 935.193 |
| 2018-05-09 | 935.216 |
| 2018-05-10 | 935.035 |
| 2018-05-11 | 935.547 |
| 2018-05-14 | 934.858 |
| 2018-05-15 | 935.485 |
| 2018-05-16 | 935.015 |
| 2018-05-17 | 935.038 |
| 2018-05-18 | 935.016 |
| 2018-05-21 | 933.543 |
| 2018-05-22 | 933.227 |
| 2018-05-23 | 933.018 |
| 2018-05-24 | 932.89 |
| 2018-05-25 | 932.7 |
| 2018-05-28 | 932.717 |
| 2018-05-29 | 933.323 |
| 2018-05-30 | 935.415 |
| 2018-05-31 | 934.022 |
| 2018-06-01 | 934.295 |
| 2018-06-04 | 936.528 |
| 2018-06-05 | 935.74 |
| 2018-06-06 | 935.341 |
| 2018-06-07 | 935.625 |
| 2018-06-08 | 936.04 |
| 2018-06-11 | 936.491 |
| 2018-06-12 | 936.965 |
| 2018-06-13 | 937.281 |
| 2018-06-14 | 937.187 |
| 2018-06-15 | 936.847 |
| 2018-06-18 | 937.216 |
| 2018-06-19 | 937.485 |
| 2018-06-20 | 937.481 |
| 2018-06-21 | 937.243 |
| 2018-06-22 | 937.112 |
| 2018-06-25 | 936.943 |
| 2018-06-26 | 936.655 |
| 2018-06-27 | 936.328 |
| 2018-06-28 | 935.799 |
| 2018-06-29 | 935.361 |
| 2018-07-02 | 932.999 |
| 2018-07-03 | 935.226 |
| 2018-07-04 | 934.934 |
| 2018-07-05 | 934.863 |
| 2018-07-06 | 934.188 |
| 2018-07-09 | 934.172 |
| 2018-07-10 | 934.042 |
| 2018-07-11 | 934.341 |
| 2018-07-12 | 934.175 |
| 2018-07-13 | 934.126 |
| 2018-07-16 | 933.957 |
| 2018-07-17 | 933.898 |
| 2018-07-18 | 933.532 |
| 2018-07-19 | 933.166 |
| 2018-07-20 | 933.214 |
| 2018-07-23 | 933.035 |
| 2018-07-24 | 932.989 |
| 2018-07-26 | 932.836 |
| 2018-07-27 | 932.168 |
| 2018-07-30 | 931.191 |
| 2018-07-31 | 931.251 |
| 2018-08-01 | 931.106 |
| 2018-08-03 | 931.013 |
| 2018-08-06 | 930.906 |
| 2018-08-07 | 930.739 |
| 2018-08-08 | 930.214 |
| 2018-08-09 | 929.092 |
| 2018-08-10 | 928.409 |
| 2018-08-13 | 925.983 |
| 2018-08-14 | 924.54 |
| 2018-08-16 | 924.633 |
| 2018-08-17 | 924.788 |
| 2018-08-20 | 924.833 |
| 2018-08-21 | 923.435 |
| 2018-08-22 | 924.02 |
| 2018-08-23 | 923.964 |
| 2018-08-24 | 924.084 |
| 2018-08-27 | 924.009 |
| 2018-08-28 | 923.794 |
| 2018-08-29 | 923.055 |
| 2018-08-30 | 922.688 |
| 2018-08-31 | 922.37 |
| 2018-09-03 | 922.202 |
| 2018-09-04 | 922.149 |
| 2018-09-05 | 922.131 |
| 2018-09-06 | 921.765 |
| 2018-09-07 | 921.748 |
| 2018-09-10 | 919.664 |
| 2018-09-11 | 916.006 |
| 2018-09-12 | 914.884 |
| 2018-09-13 | 914.129 |
| 2018-09-14 | 913.692 |
| 2018-09-17 | 913.028 |
| 2018-09-18 | 912.606 |
| 2018-09-19 | 911.817 |
| 2018-09-20 | 910.851 |
| 2018-09-21 | 908.953 |
| 2018-09-24 | 905.658 |
| 2018-09-25 | 906.99 |
| 2018-09-26 | 906.002 |
| 2018-09-27 | 903.501 |
| 2018-09-28 | 902.146 |
| 2018-10-01 | 902.146 |
| 2018-10-02 | 901.532 |
| 2018-10-03 | 901.278 |
| 2018-10-04 | 900.516 |
| 2018-10-05 | 900.294 |
| 2018-10-08 | 900.223 |
| 2018-10-09 | 900.889 |
| 2018-10-10 | 900.853 |
| 2018-10-11 | 900.279 |
| 2018-10-12 | 900.08 |
| 2018-10-16 | 900.09 |
| 2018-10-17 | 899.58 |
| 2018-10-18 | 898.955 |
| 2018-10-19 | 898.94 |
| 2018-10-22 | 898.775 |
| 2018-10-23 | 898.551 |
| 2018-10-24 | 897.728 |
| 2018-10-25 | 896.974 |
| 2018-10-26 | 896.96 |
| 2018-10-29 | 896.751 |
| 2018-10-30 | 896.373 |
| 2018-10-31 | 896.197 |
| 2018-11-01 | 895.608 |
| 2018-11-02 | 894.764 |
| 2018-11-05 | 894.362 |
| 2018-11-06 | 894.184 |
| 2018-11-07 | 893.925 |
| 2018-11-08 | 893.947 |
| 2018-11-09 | 893.341 |
| 2018-11-12 | 892.876 |
| 2018-11-13 | 892.885 |
| 2018-11-14 | 892.278 |
| 2018-11-15 | 892.278 |
| 2018-11-16 | 891.304 |
| 2018-11-19 | 890.581 |
| 2018-11-20 | 890.081 |
| 2018-11-21 | 889.483 |
| 2018-11-22 | 889.225 |
| 2018-11-23 | 889.181 |
| 2018-11-26 | 890.858 |
| 2018-11-27 | 891.647 |
| 2018-11-28 | 892.282 |
| 2018-11-29 | 892.072 |
| 2018-11-30 | 892.613 |
| 2018-12-03 | 892.251 |
| 2018-12-04 | 892.522 |
| 2018-12-05 | 891.806 |
| 2018-12-06 | 891.78 |
| 2018-12-07 | 891.25 |
| 2018-12-10 | 889.291 |
| 2018-12-11 | 889.046 |
| 2018-12-12 | 889.073 |
| 2018-12-13 | 889.001 |
| 2018-12-14 | 889.106 |
| 2018-12-17 | 889.139 |
| 2018-12-18 | 889.168 |
| 2018-12-19 | 888.833 |
| 2018-12-20 | 889.245 |
| 2018-12-21 | 889.334 |
| 2018-12-24 | 889.334 |
| 2018-12-26 | 889.435 |
| 2018-12-27 | 889.468 |
| 2018-12-28 | 889.623 |
| 2019-01-02 | 889.66 |
| 2019-01-03 | 889.697 |
| 2019-01-04 | 889.772 |
| 2019-01-07 | 889.809 |
| 2019-01-08 | 889.851 |
| 2019-01-09 | 889.863 |
| 2019-01-10 | 889.78 |
| 2019-01-11 | 890.09 |
| 2019-01-14 | 890.095 |
| 2019-01-15 | 890.01 |
| 2019-01-16 | 889.843 |
| 2019-01-17 | 889.481 |
| 2019-01-18 | 889.359 |
| 2019-01-21 | 889.379 |
| 2019-01-22 | 889.797 |
| 2019-01-23 | 889.787 |
| 2019-01-24 | 889.753 |
| 2019-01-25 | 889.535 |
| 2019-01-28 | 888.725 |
| 2019-01-29 | 888.755 |
| 2019-01-30 | 888.63 |
| 2019-01-31 | 888.813 |
| 2019-02-01 | 888.776 |
| 2019-02-04 | 888.838 |
| 2019-02-05 | 888.899 |
| 2019-02-06 | 889.095 |
| 2019-02-07 | 887.663 |
| 2019-02-08 | 887.822 |
| 2019-02-11 | 887.662 |
| 2019-02-12 | 888.197 |
| 2019-02-13 | 888.352 |
| 2019-02-14 | 887.487 |
| 2019-02-15 | 887.546 |
| 2019-02-18 | 887.301 |
| 2019-02-19 | 886.738 |
| 2019-02-20 | 887.232 |
| 2019-02-21 | 887.261 |
| 2019-02-22 | 887.543 |
| 2019-02-25 | 887.515 |
| 2019-02-26 | 887.529 |
| 2019-02-27 | 886.822 |
| 2019-02-28 | 886.917 |
| 2019-03-01 | 886.982 |
| 2019-03-04 | 886.517 |
| 2019-03-05 | 887.332 |
| 2019-03-06 | 886.294 |
| 2019-03-07 | 886.151 |
| 2019-03-08 | 885.889 |
| 2019-03-11 | 885.959 |
| 2019-03-12 | 886.161 |
| 2019-03-13 | 869.243 |
| 2019-03-14 | 869.276 |
| 2019-03-15 | 869.575 |
| 2019-03-18 | 869.144 |
| 2019-03-19 | 867.828 |
| 2019-03-20 | 866.659 |
| 2019-03-21 | 867.868 |
| 2019-03-22 | 864.246 |
| 2019-03-25 | 863.343 |
| 2019-03-26 | 862.42 |
| 2019-03-27 | 862.316 |
| 2019-03-28 | 864.949 |
| 2019-03-29 | 865.59 |
| 2019-04-01 | 865.59 |
| 2019-04-02 | 865.451 |
| 2019-04-03 | 867.642 |
| 2019-04-04 | 868.76 |
| 2019-04-05 | 872.449 |
| 2019-04-08 | 874.07 |
| 2019-04-09 | 876.591 |
| 2019-04-10 | 878.313 |
| 2019-04-12 | 880.537 |
| 2019-04-15 | 881.643 |
| 2019-04-16 | 881.712 |
| 2019-04-17 | 881.901 |
| 2019-04-22 | 884.465 |
| 2019-04-23 | 886.524 |
| 2019-04-24 | 889.418 |
| 2019-04-25 | 894.1 |
| 2019-04-26 | 897.805 |
| 2019-04-29 | 899.275 |
| 2019-04-30 | 902.888 |
| 2019-05-02 | 904.989 |
| 2019-05-03 | 907.857 |
| 2019-05-06 | 907.611 |
| 2019-05-07 | 907.608 |
| 2019-05-08 | 907.374 |
| 2019-05-09 | 908.493 |
| 2019-05-10 | 908.586 |
| 2019-05-13 | 908.497 |
| 2019-05-14 | 909.077 |
| 2019-05-15 | 909.618 |
| 2019-05-16 | 909.8 |
| 2019-05-17 | 909.8 |
| 2019-05-20 | 911.426 |
| 2019-05-21 | 916.207 |
| 2019-05-22 | 916.423 |
| 2019-05-23 | 917.15 |
| 2019-05-24 | 916.904 |
| 2019-05-27 | 918.331 |
| 2019-05-28 | 918.697 |
| 2019-05-29 | 920.356 |
| 2019-05-30 | 920.96 |
| 2019-05-31 | 920.756 |
| 2019-06-03 | 921.047 |
| 2019-06-04 | 922.809 |
| 2019-06-06 | 925.406 |
| 2019-06-07 | 928.869 |
| 2019-06-10 | 930.768 |
| 2019-06-11 | 930.96 |
| 2019-06-12 | 930.533 |
| 2019-06-13 | 930.251 |
| 2019-06-14 | 930.494 |
| 2019-06-17 | 929.635 |
| 2019-06-18 | 927.956 |
| 2019-06-19 | 926.887 |
| 2019-06-20 | 926.321 |
| 2019-06-21 | 926.122 |
| 2019-06-24 | 926.071 |
| 2019-06-25 | 926.221 |
| 2019-06-26 | 929.027 |
| 2019-06-27 | 930.932 |
| 2019-06-28 | 931.964 |
| 2019-07-01 | 931.964 |
| 2019-07-02 | 932.666 |
| 2019-07-03 | 932.985 |
| 2019-07-04 | 933.923 |
| 2019-07-05 | 934.138 |
| 2019-07-06 | 934.391 |
| 2019-07-07 | 934.946 |
| 2019-07-08 | 935.113 |
| 2019-07-09 | 935.913 |
| 2019-07-10 | 935.913 |
| 2019-07-11 | 937.184 |
| 2019-07-12 | 938.238 |
| 2019-07-13 | 939.76 |
| 2019-07-14 | 942.081 |
| 2019-07-18 | 944.605 |
| 2019-07-19 | 948.052 |
| 2019-07-22 | 949.794 |
| 2019-07-23 | 952.389 |
| 2019-07-24 | 953.513 |
| 2019-07-26 | 954.894 |
| 2019-07-29 | 956.436 |
| 2019-07-30 | 957.261 |
| 2019-07-31 | 958.09 |
| 2019-08-01 | 958.855 |
| 2019-08-05 | 959.271 |
| 2019-08-06 | 958.961 |
| 2019-08-07 | 959.18 |
| 2019-08-08 | 958.769 |
| 2019-08-09 | 957.886 |
| 2019-08-12 | 957.42 |
| 2019-08-13 | 957.059 |
| 2019-08-14 | 956.456 |
| 2019-08-16 | 956.043 |
| 2019-08-19 | 955.672 |
| 2019-08-20 | 954.724 |
| 2019-08-21 | 953.096 |
| 2019-08-22 | 952.824 |
| 2019-08-23 | 951.75 |
| 2019-08-26 | 949.625 |
| 2019-08-27 | 948.53 |
| 2019-08-28 | 947.658 |
| 2019-08-29 | 947.861 |
| 2019-08-30 | 947.962 |
| 2019-09-02 | 948.15 |
| 2019-09-03 | 948.007 |
| 2019-09-04 | 947.762 |
| 2019-09-05 | 947.852 |
| 2019-09-06 | 948.263 |
| 2019-09-09 | 947.832 |
| 2019-09-10 | 947.891 |
| 2019-09-11 | 948.224 |
| 2019-09-12 | 948.002 |
| 2019-09-13 | 948.033 |
| 2019-09-16 | 947.451 |
| 2019-09-17 | 946.997 |
| 2019-09-18 | 947.148 |
| 2019-09-19 | 947.383 |
| 2019-09-20 | 947.465 |
| 2019-09-23 | 947.519 |
| 2019-09-24 | 947.769 |
| 2019-09-25 | 948.386 |
| 2019-09-26 | 948.956 |
| 2019-09-27 | 949.161 |
| 2019-09-30 | 949.135 |
| 2019-10-01 | 950.608 |
| 2019-10-02 | 950.927 |
| 2019-10-03 | 951.18 |
| 2019-10-04 | 951.421 |
| 2019-10-07 | 951.343 |
| 2019-10-08 | 951.071 |
| 2019-10-09 | 951.481 |
| 2019-10-10 | 951.731 |
| 2019-10-11 | 951.38 |
| 2019-10-14 | 951.291 |
| 2019-10-15 | 951.029 |
| 2019-10-16 | 951.274 |
| 2019-10-17 | 951.397 |
| 2019-10-18 | 952.086 |
| 2019-10-21 | 952.111 |
| 2019-10-22 | 952.242 |
| 2019-10-23 | 952.477 |
| 2019-10-24 | 952.214 |
| 2019-10-25 | 951.514 |
| 2019-10-28 | 951.24 |
| 2019-10-29 | 950.844 |
| 2019-10-30 | 950.37 |
| 2019-10-31 | 951.034 |
| 2019-11-01 | 952.162 |
| 2019-11-04 | 952.965 |
| 2019-11-05 | 955.932 |
| 2019-11-06 | 958.023 |
| 2019-11-07 | 958.564 |
| 2019-11-08 | 959.444 |
| 2019-11-11 | 959.961 |
| 2019-11-12 | 960.141 |
| 2019-11-13 | 959.708 |
| 2019-11-14 | 959.4 |
| 2019-11-15 | 958.969 |
| 2019-11-18 | 959.281 |
| 2019-11-19 | 960.044 |
| 2019-11-20 | 959.789 |
| 2019-11-21 | 959.724 |
| 2019-11-22 | 960.276 |
| 2019-11-25 | 960.724 |
| 2019-11-26 | 961.571 |
| 2019-11-27 | 962.25 |
| 2019-11-28 | 962.883 |
| 2019-11-29 | 963.088 |
| 2019-12-02 | 963.44 |
| 2019-12-03 | 964.005 |
| 2019-12-04 | 964.173 |
| 2019-12-05 | 964.501 |
| 2019-12-06 | 964.823 |
| 2019-12-09 | 965.331 |
| 2019-12-10 | 965.6 |
| 2019-12-11 | 965.896 |
| 2019-12-12 | 966.464 |
| 2019-12-13 | 967.069 |
| 2019-12-16 | 967.387 |
| 2019-12-17 | 968.884 |
| 2019-12-18 | 970.856 |
| 2019-12-19 | 972.391 |
| 2019-12-20 | 972.964 |
| 2019-12-23 | 973.826 |
| 2019-12-24 | 973.67 |
| 2020-01-02 | 973.784 |
| 2020-01-03 | 973.649 |
| 2020-01-06 | 973.793 |
| 2020-01-07 | 974.917 |
| 2020-01-08 | 976.57 |
| 2020-01-09 | 978.929 |
| 2020-01-10 | 980.524 |
| 2020-01-13 | 982.86 |
| 2020-01-14 | 984.674 |
| 2020-01-15 | 986.106 |
| 2020-01-16 | 988.397 |
| 2020-01-17 | 988.894 |
| 2020-01-20 | 989.805 |
| 2020-01-21 | 990.02 |
| 2020-01-22 | 991.165 |
| 2020-01-23 | 992.221 |
| 2020-01-24 | 993.551 |
| 2020-01-27 | 993.48 |
| 2020-01-28 | 993.644 |
| 2020-01-29 | 994.604 |
| 2020-01-30 | 994.601 |
| 2020-01-31 | 994.676 |
| 2020-02-03 | 995.295 |
| 2020-02-04 | 995.567 |
| 2020-02-05 | 995.977 |
| 2020-02-06 | 995.121 |
| 2020-02-07 | 995.543 |
| 2020-02-10 | 995.108 |
| 2020-02-11 | 994.592 |
| 2020-02-12 | 993.635 |
| 2020-02-13 | 990.917 |
| 2020-02-14 | 988.326 |
| 2020-02-17 | 984.48 |
| 2020-02-18 | 980.246 |
| 2020-02-19 | 980.581 |
| 2020-02-20 | 981.304 |
| 2020-02-21 | 981.306 |
| 2020-02-24 | 980.65 |
| 2020-02-25 | 982.058 |
| 2020-02-26 | 982.403 |
| 2020-02-27 | 982.316 |
| 2020-02-28 | 982.583 |
| 2020-03-02 | 982.685 |
| 2020-03-03 | 983.422 |
| 2020-03-04 | 983.946 |
| 2020-03-05 | 985.011 |
| 2020-03-06 | 984.742 |
| 2020-03-09 | 984.363 |
| 2020-03-10 | 983.377 |
| 2020-03-11 | 982.133 |
| 2020-03-12 | 979.242 |
| 2020-03-13 | 977.733 |
| 2020-03-16 | 976.322 |
| 2020-03-17 | 974.445 |
| 2020-03-18 | 971.86 |
| 2020-03-19 | 968.984 |
| 2020-03-20 | 963.536 |
| 2020-03-23 | 962.796 |
| 2020-03-24 | 961.541 |
| 2020-03-25 | 958.811 |
| 2020-03-26 | 957.806 |
| 2020-03-27 | 953.677 |
| 2020-03-30 | 941.835 |
| 2020-03-31 | 939.213 |
| 2020-04-01 | 938.537 |
| 2020-04-02 | 935.458 |
| 2020-04-03 | 938.677 |
| 2020-04-13 | 935.609 |
| 2020-04-14 | 926.68 |
| 2020-04-15 | 925.604 |
| 2020-04-16 | 925.336 |
| 2020-04-17 | 922.054 |
| 2020-04-20 | 920.454 |
| 2020-04-21 | 916.043 |
| 2020-04-22 | 914.055 |
| 2020-04-23 | 911.678 |
| 2020-04-24 | 910.009 |
| 2020-04-27 | 906.18 |
| 2020-04-28 | 905.765 |
| 2020-04-29 | 907.459 |
| 2020-04-30 | 909.421 |
| 2020-05-04 | 909.497 |
| 2020-05-05 | 910.402 |
| 2020-05-06 | 907.732 |
| 2020-05-07 | 905.994 |
| 2020-05-08 | 906.201 |
| 2020-05-11 | 907.354 |
| 2020-05-12 | 908.369 |
| 2020-05-13 | 909.026 |
| 2020-05-14 | 909.396 |
| 2020-05-15 | 909.817 |
| 2020-05-18 | 909.617 |
| 2020-05-19 | 909.248 |
| 2020-05-20 | 909.173 |
| 2020-05-21 | 908.865 |
| 2020-05-22 | 909.066 |
| 2020-05-25 | 908.955 |
| 2020-05-26 | 911.258 |
| 2020-05-27 | 913.09 |
| 2020-05-28 | 914.613 |
| 2020-05-29 | 915.353 |
| 2020-06-01 | 915.161 |
| 2020-06-02 | 915.344 |
| 2020-06-03 | 915.839 |
| 2020-06-04 | 916.777 |
| 2020-06-05 | 917.046 |
| 2020-06-08 | 917.677 |
| 2020-06-09 | 919.091 |
| 2020-06-10 | 920.018 |
| 2020-06-11 | 921.746 |
| 2020-06-12 | 921.413 |
| 2020-06-15 | 921.545 |
| 2020-06-16 | 921.809 |
| 2020-06-17 | 922.339 |
| 2020-06-18 | 921.423 |
| 2020-06-19 | 921.181 |
| 2020-06-22 | 921.33 |
| 2020-06-23 | 922.902 |
| 2020-06-24 | 924.787 |
| 2020-06-25 | 925.673 |
| 2020-06-26 | 926.206 |
| 2020-06-29 | 926.931 |
| 2020-06-30 | 927.596 |
| 2020-07-01 | 927.768 |
| 2020-07-02 | 930.578 |
| 2020-07-03 | 931.384 |
| 2020-07-06 | 931.825 |
| 2020-07-07 | 933.301 |
| 2020-07-08 | 935.415 |
| 2020-07-09 | 937.384 |
| 2020-07-10 | 940.57 |
| 2020-07-13 | 939.802 |
| 2020-07-14 | 939.694 |
| 2020-07-15 | 941.046 |
| 2020-07-16 | 941.58 |
| 2020-07-17 | 941.565 |
| 2020-07-20 | 941.586 |
| 2020-07-21 | 941.025 |
| 2020-07-22 | 941.162 |
| 2020-07-23 | 940.659 |
| 2020-07-24 | 940.424 |
| 2020-07-28 | 938.97 |
| 2020-07-29 | 937.631 |
| 2020-07-30 | 936.987 |
| 2020-07-31 | 936.723 |
| 2020-08-03 | 936.478 |
| 2020-08-04 | 935.469 |
| 2020-08-05 | 934.721 |
| 2020-08-06 | 933.842 |
| 2020-08-07 | 933.303 |
| 2020-08-10 | 933.067 |
| 2020-08-11 | 933.351 |
| 2020-08-12 | 933.324 |
| 2020-08-13 | 933.457 |
| 2020-08-14 | 932.834 |
| 2020-08-18 | 932.283 |
| 2020-08-19 | 931.756 |
| 2020-08-20 | 930.664 |
| 2020-08-21 | 930.084 |
| 2020-08-24 | 929.898 |
| 2020-08-25 | 929.926 |
| 2020-08-26 | 930.645 |
| 2020-08-27 | 932.414 |
| 2020-08-28 | 933.082 |
| 2020-08-31 | 933.889 |
| 2020-09-01 | 934.43 |
| 2020-09-02 | 935.629 |
| 2020-09-03 | 937.039 |
| 2020-09-04 | 937.407 |
| 2020-09-07 | 937.498 |
| 2020-09-08 | 937.806 |
| 2020-09-09 | 938.298 |
| 2020-09-10 | 937.633 |
| 2020-09-11 | 937.886 |
| 2020-09-15 | 938.603 |
| 2020-09-16 | 944.744 |
| 2020-09-17 | 944.45 |
| 2020-09-18 | 944.381 |
| 2020-09-21 | 941.154 |
| 2020-09-22 | 941.086 |
| 2020-09-23 | 940.936 |
| 2020-09-24 | 940.726 |
| 2020-09-25 | 940.439 |
| 2020-09-28 | 940.342 |
| 2020-09-29 | 939.975 |
| 2020-09-30 | 939.632 |